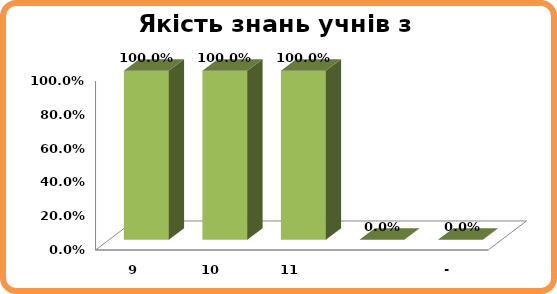
| Category | Series 0 |
|---|---|
| 9 | 1 |
| 10 | 1 |
| 11 | 1 |
|  | 0 |
| - | 0 |